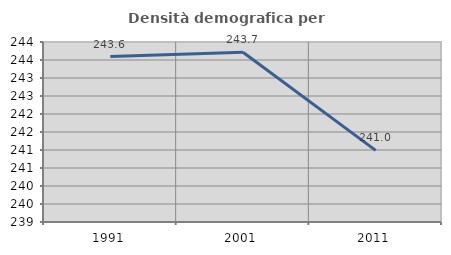
| Category | Densità demografica |
|---|---|
| 1991.0 | 243.595 |
| 2001.0 | 243.716 |
| 2011.0 | 240.989 |